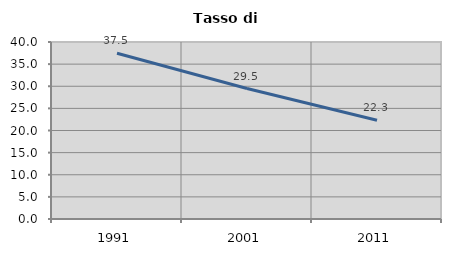
| Category | Tasso di disoccupazione   |
|---|---|
| 1991.0 | 37.464 |
| 2001.0 | 29.485 |
| 2011.0 | 22.323 |